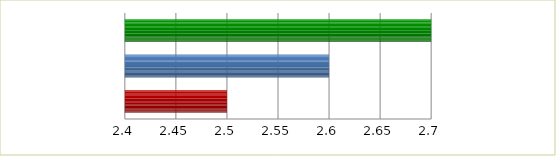
| Category | Series 0 | Series 1 |
|---|---|---|
| 0 | 2.5 | 0 |
| 1 | 2.6 | 0 |
| 2 | 2.7 | 0 |